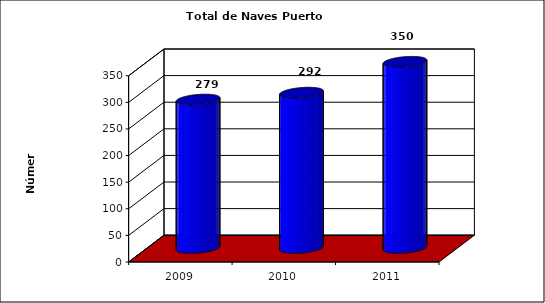
| Category | Series 0 |
|---|---|
| 2009.0 | 279 |
| 2010.0 | 292 |
| 2011.0 | 350 |